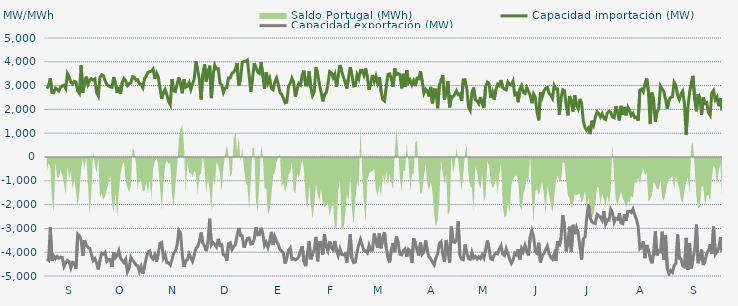
| Category | Capacidad importación (MW) | Capacidad exportación (MW) |
|---|---|---|
| 0 | 2868.75 | -4282.5 |
| 1900-01-01 | 3000 | -4340.625 |
| 1900-01-02 | 3307.5 | -2947.5 |
| 1900-01-03 | 2713.125 | -4359.375 |
| 1900-01-04 | 2701.875 | -4158.75 |
| 1900-01-05 | 2896.875 | -4276.875 |
| 1900-01-06 | 2842.5 | -4177.5 |
| 1900-01-07 | 2773.125 | -4254.375 |
| 1900-01-08 | 2930.625 | -4201.875 |
| 1900-01-09 | 2990.625 | -4224.375 |
| 1900-01-10 | 3015 | -4603.125 |
| 1900-01-11 | 2883.75 | -4436.25 |
| 1900-01-12 | 3506.25 | -4342.5 |
| 1900-01-13 | 3367.5 | -4393.125 |
| 1900-01-14 | 3144.375 | -4653.75 |
| 1900-01-15 | 3063.75 | -4419.375 |
| 1900-01-16 | 3178.125 | -4456.875 |
| 1900-01-17 | 3153.75 | -4695 |
| 1900-01-18 | 2768.542 | -3240.125 |
| 1900-01-19 | 2672.083 | -3304.625 |
| 1900-01-20 | 3855 | -3498.75 |
| 1900-01-21 | 2703.125 | -4151.25 |
| 1900-01-22 | 3123.333 | -3495.125 |
| 1900-01-23 | 3376.875 | -3697.5 |
| 1900-01-24 | 3048.75 | -3805.875 |
| 1900-01-25 | 3225 | -3836.25 |
| 1900-01-26 | 3286.875 | -4085.625 |
| 1900-01-27 | 3230.625 | -4353.75 |
| 1900-01-28 | 3279.375 | -4267.5 |
| 1900-01-29 | 2704.917 | -4449.375 |
| 1900-01-30 | 2563.833 | -4725 |
| 1900-01-31 | 3360 | -4325.625 |
| 1900-02-01 | 3457.5 | -4035 |
| 1900-02-02 | 3420 | -4078.125 |
| 1900-02-03 | 3202.5 | -4005 |
| 1900-02-04 | 3050.625 | -4383.75 |
| 1900-02-05 | 2992.5 | -4301.25 |
| 1900-02-06 | 2938.125 | -4320 |
| 1900-02-07 | 2928.75 | -4614.375 |
| 1900-02-08 | 3356.25 | -4010.625 |
| 1900-02-09 | 3093.75 | -4231.875 |
| 1900-02-10 | 2686.875 | -4143.75 |
| 1900-02-11 | 2947.5 | -3935.625 |
| 1900-02-12 | 2664.375 | -4254.375 |
| 1900-02-13 | 3127.5 | -4350 |
| 1900-02-14 | 3300 | -4443.75 |
| 1900-02-15 | 3198.542 | -4296 |
| 1900-02-16 | 3001.875 | -4828.125 |
| 1900-02-17 | 3088.125 | -4666.875 |
| 1900-02-18 | 3110.625 | -4215 |
| 1900-02-19 | 3373.125 | -4336.875 |
| 1900-02-20 | 3345 | -4417.5 |
| 1900-02-21 | 3226.875 | -4541.25 |
| 1900-02-22 | 3251.25 | -4569.375 |
| 1900-02-23 | 3069.375 | -4816.875 |
| 1900-02-24 | 3046.875 | -4610.625 |
| 1900-02-25 | 2910 | -4897.5 |
| 1900-02-26 | 3309.375 | -4593.75 |
| 1900-02-27 | 3399.792 | -4243 |
| 1900-02-28 | 3556.875 | -3988.125 |
| 1900-02-28 | 3585.6 | -3948.08 |
| 1900-03-01 | 3605.625 | -4208.542 |
| 1900-03-02 | 3697.5 | -4290 |
| 1900-03-03 | 3291.25 | -4115.625 |
| 1900-03-04 | 3523.125 | -4398.75 |
| 1900-03-05 | 3371.25 | -4055.625 |
| 1900-03-06 | 2883.75 | -3628.125 |
| 1900-03-07 | 2445 | -3590.625 |
| 1900-03-08 | 2711.25 | -4233.75 |
| 1900-03-09 | 2842.292 | -4080 |
| 1900-03-10 | 2631.042 | -4443.75 |
| 1900-03-11 | 2333.542 | -4443.75 |
| 1900-03-12 | 2201.25 | -4537.5 |
| 1900-03-13 | 3275.625 | -4314.375 |
| 1900-03-14 | 2778.75 | -4038.75 |
| 1900-03-15 | 2749.167 | -3955 |
| 1900-03-16 | 3064.375 | -3696.875 |
| 1900-03-17 | 3341.083 | -3091.583 |
| 1900-03-18 | 3070.042 | -3200 |
| 1900-03-19 | 2678.625 | -4117.917 |
| 1900-03-20 | 3264.375 | -4610.625 |
| 1900-03-21 | 2928.75 | -4363.125 |
| 1900-03-22 | 2966.25 | -4316.25 |
| 1900-03-23 | 3121.875 | -4074.375 |
| 1900-03-24 | 2836.875 | -4230 |
| 1900-03-25 | 3078.75 | -4385.625 |
| 1900-03-26 | 3281.25 | -4121.25 |
| 1900-03-27 | 4027.5 | -3836.25 |
| 1900-03-28 | 3646.875 | -3765 |
| 1900-03-29 | 3256.875 | -3536.25 |
| 1900-03-30 | 2419.833 | -3170.625 |
| 1900-03-31 | 3472.5 | -3611.25 |
| 1900-04-01 | 3890.625 | -3742.5 |
| 1900-04-02 | 3166.875 | -3954.375 |
| 1900-04-03 | 3577.5 | -3583.125 |
| 1900-04-04 | 3836 | -2595.625 |
| 1900-04-05 | 2475 | -3700 |
| 1900-04-06 | 3466.875 | -3605.625 |
| 1900-04-07 | 3856.875 | -3676.458 |
| 1900-04-08 | 3697.5 | -3778.125 |
| 1900-04-09 | 3708.75 | -3440.625 |
| 1900-04-10 | 3125.625 | -3712.5 |
| 1900-04-11 | 3026.792 | -3685.625 |
| 1900-04-12 | 2711.458 | -4111.875 |
| 1900-04-13 | 2894.583 | -4117.5 |
| 1900-04-14 | 2908.583 | -4353.75 |
| 1900-04-15 | 3321.875 | -3639.375 |
| 1900-04-16 | 3324.375 | -3603.75 |
| 1900-04-17 | 3515.833 | -3886.875 |
| 1900-04-18 | 3562.5 | -3763.125 |
| 1900-04-19 | 3684.792 | -3688.125 |
| 1900-04-20 | 3950.625 | -3281.25 |
| 1900-04-21 | 3006.042 | -2979.375 |
| 1900-04-22 | 3276.667 | -3305.625 |
| 1900-04-23 | 3978.75 | -3315 |
| 1900-04-24 | 4018.125 | -3806.25 |
| 1900-04-25 | 4020 | -3611.25 |
| 1900-04-26 | 4072.5 | -3421.458 |
| 1900-04-27 | 3435 | -3400.208 |
| 1900-04-28 | 2733.458 | -3658.125 |
| 1900-04-29 | 3328.542 | -3637.5 |
| 1900-04-30 | 3937.5 | -3451.875 |
| 1900-05-01 | 3746.25 | -2948.958 |
| 1900-05-02 | 3564.375 | -3273.75 |
| 1900-05-03 | 3513.75 | -3266.25 |
| 1900-05-04 | 3975 | -2973.75 |
| 1900-05-05 | 3418.125 | -3228.75 |
| 1900-05-06 | 2868.75 | -3712.5 |
| 1900-05-07 | 3568.125 | -3577.5 |
| 1900-05-08 | 3120 | -3802.5 |
| 1900-05-09 | 3305.625 | -3564.375 |
| 1900-05-10 | 2884.375 | -3145.875 |
| 1900-05-11 | 2826.25 | -3695.625 |
| 1900-05-12 | 3149.792 | -3346.875 |
| 1900-05-13 | 3321.458 | -3540 |
| 1900-05-14 | 3048.75 | -3665.625 |
| 1900-05-15 | 2704.25 | -3881.25 |
| 1900-05-16 | 2627.25 | -3950.625 |
| 1900-05-17 | 2475.708 | -4038.75 |
| 1900-05-18 | 2277.917 | -4477.5 |
| 1900-05-19 | 2300 | -4239.375 |
| 1900-05-20 | 2972.708 | -3928.125 |
| 1900-05-21 | 3093.75 | -3825 |
| 1900-05-22 | 3313.333 | -4297.5 |
| 1900-05-23 | 3141.75 | -4268.125 |
| 1900-05-24 | 2533.125 | -4321.875 |
| 1900-05-25 | 2863.375 | -4282.5 |
| 1900-05-26 | 3088.125 | -4185 |
| 1900-05-27 | 3024.375 | -3931.875 |
| 1900-05-28 | 3459.375 | -3751.875 |
| 1900-05-29 | 3630 | -4380 |
| 1900-05-30 | 3020.625 | -4586.25 |
| 1900-05-31 | 3020.625 | -4091.25 |
| 1900-06-01 | 3592.5 | -3540 |
| 1900-06-02 | 2925 | -4297.5 |
| 1900-06-03 | 2582.625 | -4080.542 |
| 1900-06-04 | 2730 | -3900.625 |
| 1900-06-05 | 3769.167 | -3357.25 |
| 1900-06-06 | 3498.625 | -4380 |
| 1900-06-07 | 3058.125 | -3591.583 |
| 1900-06-08 | 2735.625 | -3581.875 |
| 1900-06-09 | 2339.792 | -4096.875 |
| 1900-06-10 | 2622.625 | -3250.667 |
| 1900-06-11 | 2697.5 | -3770.625 |
| 1900-06-12 | 3064.167 | -3943.625 |
| 1900-06-13 | 3588.75 | -3549.375 |
| 1900-06-14 | 3535.75 | -3810 |
| 1900-06-15 | 3333.958 | -3898.125 |
| 1900-06-16 | 3486.625 | -3530.542 |
| 1900-06-17 | 2951.375 | -3943.125 |
| 1900-06-18 | 3439.375 | -4149.375 |
| 1900-06-19 | 3860.625 | -3864.375 |
| 1900-06-20 | 3609.583 | -4100.625 |
| 1900-06-21 | 3359.75 | -4110 |
| 1900-06-22 | 3152.25 | -4073.75 |
| 1900-06-23 | 2876.25 | -4441.875 |
| 1900-06-24 | 3331.25 | -3948.75 |
| 1900-06-25 | 3768.75 | -3251.25 |
| 1900-06-26 | 3435.667 | -4269.375 |
| 1900-06-27 | 2984.167 | -4438.125 |
| 1900-06-28 | 2998.583 | -4415.625 |
| 1900-06-29 | 3457.333 | -3980.625 |
| 1900-06-30 | 3283.042 | -3676.875 |
| 1900-07-01 | 3641.25 | -3464.5 |
| 1900-07-02 | 3640.708 | -3708.75 |
| 1900-07-03 | 3435.708 | -3937.5 |
| 1900-07-04 | 3718.125 | -3943.125 |
| 1900-07-05 | 3344.458 | -4031.25 |
| 1900-07-06 | 2827.083 | -3710.625 |
| 1900-07-07 | 3113.75 | -3920.625 |
| 1900-07-08 | 3448.125 | -3913.125 |
| 1900-07-09 | 3172.083 | -3219.375 |
| 1900-07-10 | 3397.5 | -3562.5 |
| 1900-07-11 | 3101.042 | -3819.375 |
| 1900-07-12 | 3341.25 | -3215.625 |
| 1900-07-13 | 2760.833 | -3838.125 |
| 1900-07-14 | 2417.5 | -3395.625 |
| 1900-07-15 | 2354.583 | -3155.625 |
| 1900-07-16 | 2936.875 | -3811.875 |
| 1900-07-17 | 3468.75 | -4241.25 |
| 1900-07-18 | 3495 | -4426.875 |
| 1900-07-19 | 3297.083 | -3890.625 |
| 1900-07-20 | 2946.292 | -3613.125 |
| 1900-07-21 | 3714.792 | -3997.5 |
| 1900-07-22 | 3460.833 | -3331.875 |
| 1900-07-23 | 3502.917 | -3618.5 |
| 1900-07-24 | 3472.5 | -4089.375 |
| 1900-07-25 | 2885.87 | -4111.304 |
| 1900-07-26 | 3496.875 | -3930 |
| 1900-07-27 | 2942.5 | -3858.75 |
| 1900-07-28 | 3650.625 | -4194.375 |
| 1900-07-29 | 3122.458 | -3885 |
| 1900-07-30 | 3230.042 | -3961.875 |
| 1900-07-31 | 3034.208 | -4453.125 |
| 1900-08-01 | 3206.25 | -3423.75 |
| 1900-08-02 | 2977.5 | -3611.25 |
| 1900-08-03 | 3309.375 | -3911.25 |
| 1900-08-04 | 3288.75 | -4138.125 |
| 1900-08-05 | 3602.833 | -3596.25 |
| 1900-08-06 | 3174.375 | -4080 |
| 1900-08-07 | 2683.667 | -3991.875 |
| 1900-08-08 | 2848.875 | -3504.833 |
| 1900-08-09 | 2758.542 | -3938.333 |
| 1900-08-10 | 2545.417 | -4209.375 |
| 1900-08-11 | 2945.625 | -4278.75 |
| 1900-08-12 | 2252.5 | -4423.125 |
| 1900-08-13 | 2829.375 | -4533.75 |
| 1900-08-14 | 2820.917 | -4235.625 |
| 1900-08-15 | 2048.125 | -4081.208 |
| 1900-08-16 | 3003.75 | -3632.292 |
| 1900-08-17 | 3232.5 | -3565.625 |
| 1900-08-18 | 3440.625 | -4096.875 |
| 1900-08-19 | 2422.5 | -4393.125 |
| 1900-08-20 | 2763.958 | -3487.5 |
| 1900-08-21 | 3183.75 | -3943.125 |
| 1900-08-22 | 2087.083 | -4443.75 |
| 1900-08-23 | 2547 | -2925.75 |
| 1900-08-24 | 2531.667 | -3560.625 |
| 1900-08-25 | 2628.75 | -3590.625 |
| 1900-08-26 | 2778.75 | -3480 |
| 1900-08-27 | 2617.292 | -2701.792 |
| 1900-08-28 | 2655 | -4141.875 |
| 1900-08-29 | 2355.417 | -4288.125 |
| 1900-08-30 | 3240.75 | -4318.125 |
| 1900-08-31 | 3247.5 | -3676.875 |
| 1900-09-01 | 2878.042 | -4025.625 |
| 1900-09-02 | 2109.167 | -4269.375 |
| 1900-09-03 | 1961.042 | -4299.375 |
| 1900-09-04 | 2710.208 | -4003.125 |
| 1900-09-05 | 2916 | -4248.333 |
| 1900-09-06 | 2401.875 | -4179.375 |
| 1900-09-07 | 2351.25 | -4286.25 |
| 1900-09-08 | 2238.75 | -4192.5 |
| 1900-09-09 | 2520 | -4265.625 |
| 1900-09-10 | 2227.5 | -4108.125 |
| 1900-09-11 | 2070.583 | -4246.875 |
| 1900-09-12 | 2958.75 | -3892.5 |
| 1900-09-13 | 3146.25 | -3508.125 |
| 1900-09-14 | 3087.5 | -3877.5 |
| 1900-09-15 | 2487.5 | -4284.375 |
| 1900-09-16 | 2722.5 | -4310.625 |
| 1900-09-17 | 2411.25 | -4125 |
| 1900-09-18 | 2840.5 | -4025.625 |
| 1900-09-19 | 3054.5 | -4066.875 |
| 1900-09-20 | 2992.958 | -3879.375 |
| 1900-09-21 | 3232.5 | -3729.375 |
| 1900-09-22 | 2917.5 | -4085.625 |
| 1900-09-23 | 2853.75 | -4141.875 |
| 1900-09-24 | 2819.458 | -3849.375 |
| 1900-09-25 | 3145.042 | -4061.25 |
| 1900-09-26 | 3046.958 | -4290 |
| 1900-09-27 | 3028.125 | -4468.125 |
| 1900-09-28 | 3180.542 | -4331.25 |
| 1900-09-29 | 2624.958 | -4042.5 |
| 1900-09-30 | 2676.25 | -4115.625 |
| 1900-10-01 | 2302.5 | -3873.75 |
| 1900-10-02 | 2854.208 | -4308.75 |
| 1900-10-03 | 2997.833 | -3837.167 |
| 1900-10-04 | 2709.375 | -3973.125 |
| 1900-10-05 | 2670 | -3712.958 |
| 1900-10-06 | 2913.75 | -3958.125 |
| 1900-10-07 | 2765.625 | -4134.375 |
| 1900-10-08 | 2587.5 | -3352.5 |
| 1900-10-09 | 2261.25 | -3093.75 |
| 1900-10-10 | 2651.25 | -3345.208 |
| 1900-10-11 | 2510.625 | -3963.75 |
| 1900-10-12 | 1885.875 | -4044.375 |
| 1900-10-13 | 1541.5 | -3601.375 |
| 1900-10-14 | 2707.5 | -4426.875 |
| 1900-10-15 | 2516.25 | -4128.75 |
| 1900-10-16 | 2775 | -4059.375 |
| 1900-10-17 | 2883.75 | -3906.667 |
| 1900-10-18 | 2930.625 | -3742.5 |
| 1900-10-19 | 2685 | -4061.25 |
| 1900-10-20 | 2596.875 | -4213.125 |
| 1900-10-21 | 2463.75 | -4295.625 |
| 1900-10-22 | 3005.625 | -4065 |
| 1900-10-23 | 2861.25 | -4370.625 |
| 1900-10-24 | 2855.083 | -3533.583 |
| 1900-10-25 | 1775.625 | -3751.875 |
| 1900-10-26 | 2478.75 | -3391.875 |
| 1900-10-27 | 2821.875 | -2444.375 |
| 1900-10-28 | 2782.5 | -2903.75 |
| 1900-10-29 | 2169.375 | -3964.667 |
| 1900-10-30 | 1751.292 | -3614.625 |
| 1900-10-31 | 2561.25 | -2926.875 |
| 1900-11-01 | 2356.875 | -3995.625 |
| 1900-11-02 | 1911.125 | -2849.625 |
| 1900-11-03 | 2583.75 | -3240 |
| 1900-11-04 | 2157.125 | -2962.917 |
| 1900-11-05 | 2021.375 | -3195.625 |
| 1900-11-06 | 2439.375 | -3776.25 |
| 1900-11-07 | 2235 | -4305 |
| 1900-11-08 | 1509.375 | -3436.875 |
| 1900-11-09 | 1230.208 | -3360 |
| 1900-11-10 | 1123.125 | -2546.875 |
| 1900-11-11 | 1221.25 | -1995.875 |
| 1900-11-12 | 962.083 | -2563.125 |
| 1900-11-13 | 1523.958 | -2728.125 |
| 1900-11-14 | 1344.375 | -2776.875 |
| 1900-11-15 | 1676.25 | -2795.625 |
| 1900-11-16 | 1899.375 | -2411.25 |
| 1900-11-17 | 1826.25 | -2461.875 |
| 1900-11-18 | 1680 | -2529.375 |
| 1900-11-19 | 1815 | -2662.5 |
| 1900-11-20 | 1621.458 | -2287.5 |
| 1900-11-21 | 1577.083 | -2818.125 |
| 1900-11-22 | 1846.875 | -2643.75 |
| 1900-11-23 | 1923.75 | -2656.875 |
| 1900-11-24 | 1875 | -2195.625 |
| 1900-11-25 | 1683.75 | -2330.625 |
| 1900-11-26 | 1646.25 | -2746.875 |
| 1900-11-27 | 2137.5 | -2580.5 |
| 1900-11-28 | 1860 | -2620.625 |
| 1900-11-29 | 1537.5 | -2371.875 |
| 1900-11-30 | 2149.292 | -2771.25 |
| 1900-12-01 | 1766.25 | -2801.25 |
| 1900-12-02 | 2097.75 | -2405.625 |
| 1900-12-03 | 1753.125 | -2676.75 |
| 1900-12-04 | 2090.625 | -2285.292 |
| 1900-12-05 | 1956.125 | -2274.75 |
| 1900-12-06 | 1743.75 | -2330.125 |
| 1900-12-07 | 1833.75 | -2185.875 |
| 1900-12-08 | 1651.875 | -2439.375 |
| 1900-12-09 | 1677 | -2608.125 |
| 1900-12-10 | 1526.25 | -2926.875 |
| 1900-12-11 | 2806.875 | -3847.5 |
| 1900-12-12 | 2853.75 | -3770.625 |
| 1900-12-13 | 2739.375 | -3542.5 |
| 1900-12-14 | 3086.25 | -4248.75 |
| 1900-12-15 | 3294.375 | -3694.583 |
| 1900-12-16 | 2737.5 | -3914.167 |
| 1900-12-17 | 1388.958 | -4258.125 |
| 1900-12-18 | 2705.625 | -4468.125 |
| 1900-12-19 | 2414.25 | -4032.292 |
| 1900-12-20 | 1474.5 | -3127.5 |
| 1900-12-21 | 1904.833 | -4134.375 |
| 1900-12-22 | 2018.333 | -3933.75 |
| 1900-12-23 | 2978.625 | -3980.625 |
| 1900-12-24 | 2851.875 | -3137.917 |
| 1900-12-25 | 2745 | -4327.5 |
| 1900-12-26 | 2411.25 | -3294.375 |
| 1900-12-27 | 2032.5 | -4693.125 |
| 1900-12-28 | 2394.375 | -4916.25 |
| 1900-12-29 | 2506.875 | -4770 |
| 1900-12-30 | 2527.5 | -4845 |
| 1900-12-31 | 3132.875 | -4556.25 |
| 1901-01-01 | 3001.875 | -4479.375 |
| 1901-01-02 | 2597 | -3253.75 |
| 1901-01-03 | 2415.833 | -4258.125 |
| 1901-01-04 | 2655 | -4284.375 |
| 1901-01-05 | 2764.458 | -4576.875 |
| 1901-01-06 | 2248.625 | -4616.25 |
| 1901-01-07 | 931.875 | -3396.042 |
| 1901-01-08 | 2074.792 | -4740 |
| 1901-01-09 | 2707.5 | -3624.375 |
| 1901-01-10 | 3118.125 | -4681.875 |
| 1901-01-11 | 3408.75 | -4280.625 |
| 1901-01-12 | 2415 | -3889.583 |
| 1901-01-13 | 1918.917 | -2840.25 |
| 1901-01-14 | 2645.125 | -4460.625 |
| 1901-01-15 | 2469.792 | -4186.875 |
| 1901-01-16 | 1772.542 | -3887.917 |
| 1901-01-17 | 2498.667 | -4538.125 |
| 1901-01-18 | 2245.542 | -4370 |
| 1901-01-19 | 2285.625 | -4056.25 |
| 1901-01-20 | 1862.708 | -3941.667 |
| 1901-01-21 | 1755.417 | -3663.125 |
| 1901-01-22 | 2699.583 | -4063.125 |
| 1901-01-23 | 2797.5 | -2925.625 |
| 1901-01-24 | 2403.333 | -4085.625 |
| 1901-01-25 | 2516.25 | -3971.25 |
| 1901-01-26 | 2135.625 | -3854.792 |
| 1901-01-27 | 2477.125 | -3369.292 |
| 1901-01-28 | 1956.292 | -3999.375 |